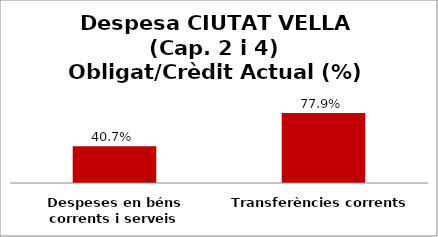
| Category | Series 0 |
|---|---|
| Despeses en béns corrents i serveis | 0.407 |
| Transferències corrents | 0.779 |